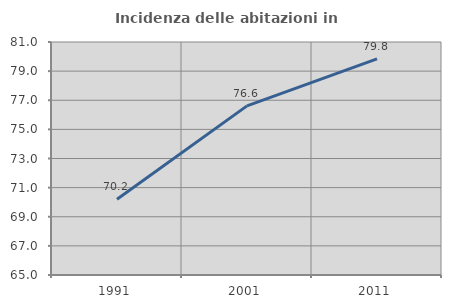
| Category | Incidenza delle abitazioni in proprietà  |
|---|---|
| 1991.0 | 70.205 |
| 2001.0 | 76.614 |
| 2011.0 | 79.837 |